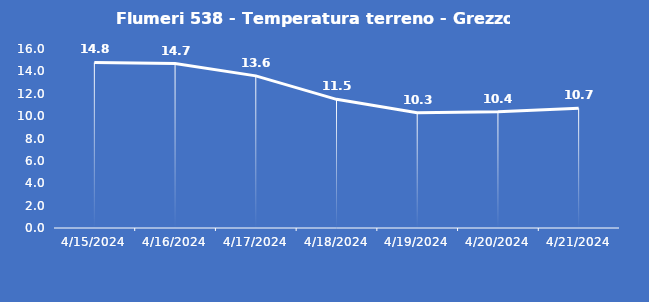
| Category | Flumeri 538 - Temperatura terreno - Grezzo (°C) |
|---|---|
| 4/15/24 | 14.8 |
| 4/16/24 | 14.7 |
| 4/17/24 | 13.6 |
| 4/18/24 | 11.5 |
| 4/19/24 | 10.3 |
| 4/20/24 | 10.4 |
| 4/21/24 | 10.7 |